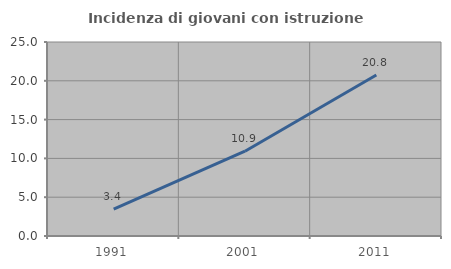
| Category | Incidenza di giovani con istruzione universitaria |
|---|---|
| 1991.0 | 3.448 |
| 2001.0 | 10.929 |
| 2011.0 | 20.755 |